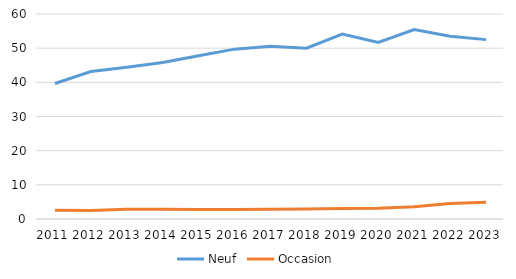
| Category | Neuf | Occasion |
|---|---|---|
| 2011.0 | 39.655 | 2.556 |
| 2012.0 | 43.178 | 2.471 |
| 2013.0 | 44.415 | 2.868 |
| 2014.0 | 45.797 | 2.874 |
| 2015.0 | 47.757 | 2.756 |
| 2016.0 | 49.713 | 2.813 |
| 2017.0 | 50.561 | 2.865 |
| 2018.0 | 49.974 | 2.897 |
| 2019.0 | 54.102 | 3.086 |
| 2020.0 | 51.688 | 3.118 |
| 2021.0 | 55.463 | 3.59 |
| 2022.0 | 53.463 | 4.567 |
| 2023.0 | 52.5 | 4.9 |